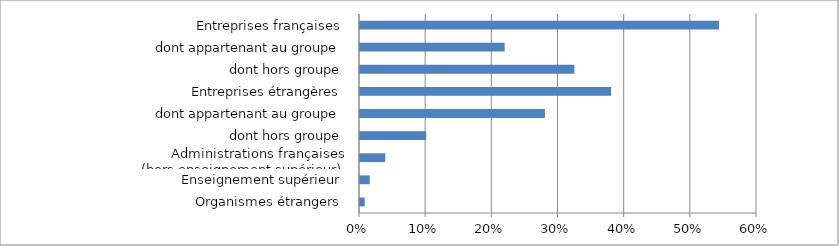
| Category | Series 0 |
|---|---|
| Organismes étrangers | 0.007 |
| Enseignement supérieur | 0.015 |
| Administrations françaises (hors enseignement supérieur) | 0.038 |
| dont hors groupe | 0.1 |
| dont appartenant au groupe | 0.279 |
| Entreprises étrangères | 0.38 |
| dont hors groupe | 0.324 |
| dont appartenant au groupe | 0.219 |
| Entreprises françaises | 0.543 |